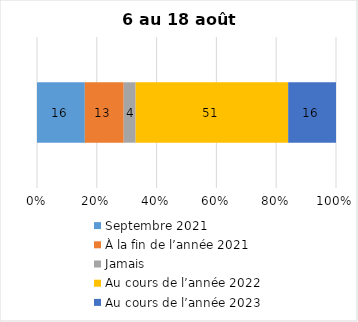
| Category | Septembre 2021 | À la fin de l’année 2021 | Jamais | Au cours de l’année 2022 | Au cours de l’année 2023 |
|---|---|---|---|---|---|
| 0 | 16 | 13 | 4 | 51 | 16 |